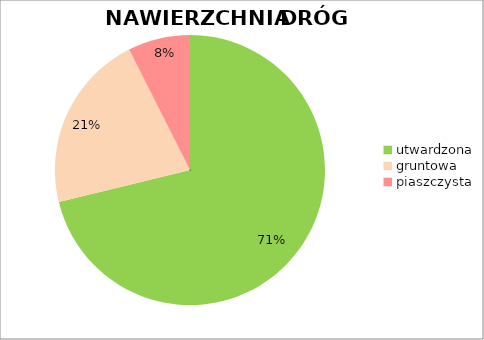
| Category | Series 0 |
|---|---|
| utwardzona | 0.712 |
| gruntowa | 0.214 |
| piaszczysta | 0.074 |